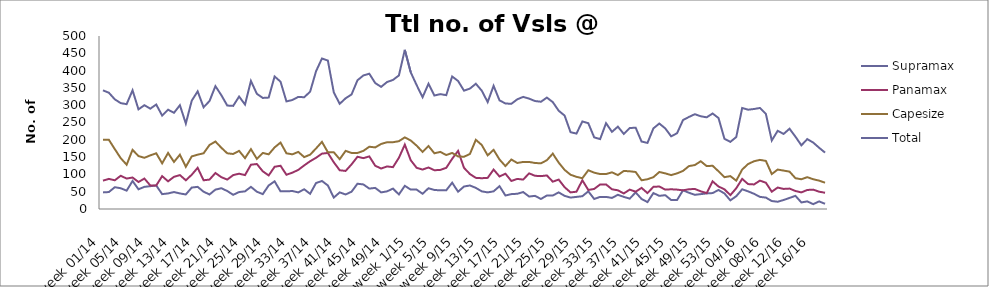
| Category | Supramax | Panamax | Capesize | Total |
|---|---|---|---|---|
| week 01/14 | 48 | 82 | 200 | 343 |
| week 02/14 | 49 | 87 | 200 | 336 |
| week 03/14 | 63 | 83 | 173 | 317 |
| week 04/14 | 60 | 96 | 147 | 306 |
| week 05/14 | 53 | 88 | 128 | 303 |
| week 06/14 | 81 | 91 | 171 | 343 |
| week 07/14 | 57 | 78 | 153 | 288 |
| week 08/14 | 64 | 88 | 148 | 300 |
| week 09/14 | 66 | 68 | 155 | 290 |
| week 10/14 | 68 | 68 | 161 | 302 |
| week 11/14 | 43 | 95 | 132 | 270 |
| week 12/14 | 45 | 80 | 162 | 287 |
| week 13/14 | 49 | 93 | 136 | 278 |
| week 14/14 | 45 | 98 | 157 | 300 |
| week 15/14 | 42 | 83 | 122 | 247 |
| week 16/14 | 62 | 99 | 152 | 313 |
| week 17/14 | 64 | 119 | 157 | 340 |
| week 18/14 | 50 | 83 | 161 | 294 |
| week 19/14 | 42 | 85 | 185 | 312 |
| week 20/14 | 56 | 104 | 195 | 355 |
| week 21/14 | 60 | 92 | 177 | 329 |
| week 22/14 | 52 | 85 | 161 | 299 |
| week 23/14 | 41 | 98 | 159 | 298 |
| week 24/14 | 49 | 102 | 168 | 325 |
| week 25/14 | 51 | 98 | 147 | 302 |
| week 26/14 | 64 | 128 | 173 | 370 |
| week 27/14 | 50 | 130 | 145 | 333 |
| week 28/14 | 43 | 109 | 162 | 321 |
| week 29/14 | 68 | 97 | 158 | 322 |
| week 30/14 | 80 | 122 | 178 | 383 |
| week 31/14 | 51 | 125 | 192 | 368 |
| week 32/14 | 51 | 99 | 161 | 311 |
| week 33/14 | 52 | 105 | 158 | 315 |
| week 34/14 | 48 | 113 | 165 | 324 |
| week 35/14 | 57 | 126 | 150 | 323 |
| week 36/14 | 44 | 138 | 157 | 339 |
| week 37/14 | 75 | 148 | 175 | 398 |
| week 38/14 | 81 | 160 | 194 | 435 |
| week 39/14 | 68 | 162 | 164 | 429 |
| week 40/14 | 33 | 135 | 164 | 337 |
| week 41/14 | 48 | 112 | 144 | 304 |
| week 42/14 | 42 | 110 | 168 | 320 |
| week 43/14 | 50 | 129 | 162 | 331 |
| week 44/14 | 73 | 151 | 162 | 372 |
| week 45/14 | 71 | 147 | 168 | 386 |
| week 46/14 | 59 | 152 | 180 | 391 |
| week 47/14 | 61 | 125 | 178 | 364 |
| week 48/14 | 48 | 117 | 188 | 353 |
| week 49/14 | 51 | 123 | 193 | 367 |
| week 50/14 | 59 | 121 | 193 | 373 |
| week 51/14 | 42 | 148 | 196 | 386 |
| week 52/14 | 67 | 186 | 207 | 460 |
| week 1/15 | 56 | 141 | 198 | 395 |
| week 2/15 | 56 | 119 | 183 | 358 |
| week 3/15 | 44 | 114 | 165 | 323 |
| week 4/15 | 60 | 120 | 182 | 362 |
| week 5/15 | 55 | 112 | 161 | 328 |
| week 6/15 | 54 | 113 | 165 | 332 |
| week 7/15 | 54 | 119 | 156 | 329 |
| week 8/15 | 76 | 145 | 162 | 383 |
| week 9/15 | 50 | 168 | 152 | 370 |
| week 10/15 | 65 | 119 | 151 | 342 |
| week 11/15 | 68 | 101 | 159 | 348 |
| week 12/15 | 61 | 90 | 200 | 362 |
| week 13/15 | 51 | 89 | 185 | 342 |
| week 14/15 | 48 | 90 | 155 | 309 |
| week 15/15 | 51 | 114 | 171 | 356 |
| week 16/15 | 66 | 94 | 143 | 314 |
| week 17/15 | 39 | 102 | 124 | 305 |
| week 18/15 | 43 | 81 | 143 | 304 |
| week 19/15 | 44 | 87 | 133 | 317 |
| week 20/15 | 49 | 85 | 136 | 324 |
| week 21/15 | 36 | 103 | 136 | 319 |
| week 22/15 | 38 | 96 | 133 | 312 |
| week 23/15 | 29 | 95 | 132 | 310 |
| week 24/15 | 39 | 97 | 141 | 322 |
| week 25/15 | 39 | 79 | 160 | 309 |
| week 26/15 | 48 | 85 | 134 | 284 |
| week 27/15 | 38 | 63 | 113 | 270 |
| week 28/15 | 33 | 48 | 99 | 222 |
| week 29/15 | 35 | 50 | 93 | 218 |
| week 30/15 | 37 | 83 | 89 | 253 |
| week 31/15 | 51 | 55 | 112 | 248 |
| week 32/15 | 29 | 58 | 105 | 207 |
| week 33/15 | 35 | 71 | 101 | 202 |
| week 34/15 | 35 | 71 | 101 | 248 |
| week 35/15 | 32 | 57 | 106 | 223 |
| week 36/15 | 41 | 54 | 98 | 238 |
| week 37/15 | 35 | 45 | 110 | 217 |
| week 38/15 | 30 | 56 | 109 | 234 |
| week 39/15 | 48 | 50 | 107 | 235 |
| week 40/15 | 29 | 61 | 83 | 195 |
| week 41/15 | 20 | 46 | 86 | 191 |
| week 42/15 | 46 | 64 | 92 | 233 |
| week 43/15 | 38 | 65 | 107 | 247 |
| week 44/15 | 40 | 56 | 103 | 233 |
| week 45/15 | 26 | 57 | 98 | 210 |
| week 46/15 | 26 | 56 | 103 | 219 |
| week 47/15 | 54 | 54 | 110 | 257 |
| week 48/15 | 47 | 57 | 124 | 266 |
| week 49/15 | 41 | 58 | 127 | 274 |
| week 50/15 | 43 | 51 | 138 | 268 |
| week 51/15 | 45 | 46 | 124 | 265 |
| week 52/15 | 46 | 80 | 125 | 276 |
| week 53/15 | 55 | 65 | 109 | 263 |
| week 01/16 | 45 | 57 | 92 | 203 |
| week 02/16 | 25 | 40 | 95 | 194 |
| week 03/16 | 37 | 60 | 82 | 208 |
| week 04/16 | 57 | 87 | 114 | 292 |
| week 05/16 | 51 | 72 | 130 | 287 |
| week 06/16 | 44 | 71 | 138 | 289 |
| week 07/16 | 35 | 82 | 142 | 292 |
| week 08/16 | 33 | 76 | 139 | 275 |
| week 09/16 | 23 | 50 | 101 | 198 |
| week 10/16 | 21 | 62 | 114 | 226 |
| week 11/16 | 26 | 58 | 111 | 217 |
| week 12/16 | 32 | 59 | 108 | 232 |
| week 13/16 | 38 | 52 | 89 | 209 |
| week 14/16 | 19 | 48 | 86 | 184 |
| week 15/16 | 22 | 55 | 92 | 202 |
| week 16/16 | 14 | 56 | 86 | 192 |
| week 17/16 | 22 | 50 | 82 | 177 |